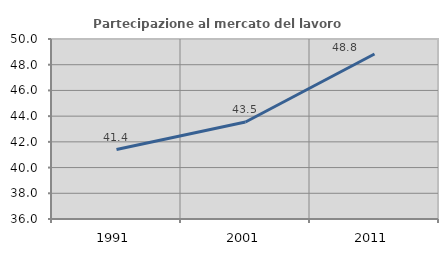
| Category | Partecipazione al mercato del lavoro  femminile |
|---|---|
| 1991.0 | 41.405 |
| 2001.0 | 43.544 |
| 2011.0 | 48.833 |